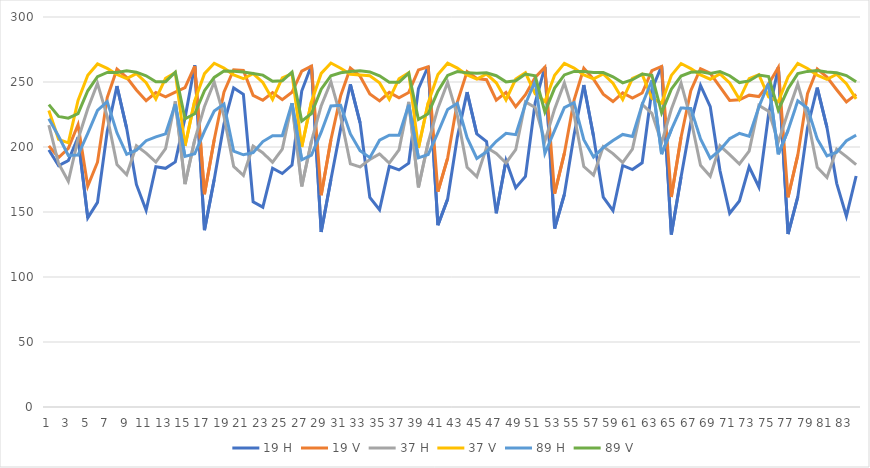
| Category | 19 H | 19 V | 37 H | 37 V | 89 H | 89 V |
|---|---|---|---|---|---|---|
| 0 | 197.769 | 200.875 | 216.859 | 228.152 | 221.763 | 232.606 |
| 1 | 185.664 | 191.903 | 187.264 | 205.915 | 208.273 | 223.528 |
| 2 | 189.548 | 198.976 | 173.655 | 203.203 | 193.484 | 222.172 |
| 3 | 207.463 | 217.152 | 205.976 | 235.809 | 193.845 | 225.63 |
| 4 | 145.507 | 169.91 | 229.481 | 255.208 | 210.51 | 243.242 |
| 5 | 157.408 | 188.291 | 248.959 | 263.892 | 228.168 | 254.049 |
| 6 | 211.956 | 238.039 | 223.364 | 260.446 | 234.919 | 257.399 |
| 7 | 246.916 | 259.882 | 186.434 | 255.78 | 210.897 | 257.335 |
| 8 | 214.356 | 253.575 | 178.645 | 252.611 | 194.408 | 258.591 |
| 9 | 171.186 | 243.856 | 200.997 | 256.49 | 197.506 | 257.573 |
| 10 | 151.32 | 235.644 | 195.333 | 249.518 | 204.865 | 254.809 |
| 11 | 184.835 | 241.928 | 188.452 | 236.967 | 207.812 | 250.217 |
| 12 | 183.611 | 238.499 | 198.761 | 252.907 | 210.122 | 250.267 |
| 13 | 188.514 | 242.228 | 235.13 | 257.22 | 232.905 | 257.479 |
| 14 | 222.418 | 245.686 | 171.485 | 200.885 | 192.765 | 221.663 |
| 15 | 262.908 | 262.143 | 205.641 | 235.632 | 194.791 | 225.559 |
| 16 | 136.057 | 163.69 | 231.211 | 256.427 | 212.262 | 243.298 |
| 17 | 174.997 | 205.547 | 249.913 | 264.417 | 227.663 | 253.489 |
| 18 | 217.568 | 242.205 | 223.716 | 260.647 | 233.077 | 258.399 |
| 19 | 245.41 | 259.436 | 185.052 | 255.526 | 196.796 | 258.195 |
| 20 | 240.513 | 258.865 | 178.175 | 252.521 | 194.008 | 257.662 |
| 21 | 157.787 | 239.756 | 200.717 | 256.419 | 195.578 | 256.552 |
| 22 | 153.734 | 235.932 | 195.523 | 249.618 | 204.179 | 255.292 |
| 23 | 183.719 | 241.878 | 188.256 | 236.606 | 208.667 | 250.536 |
| 24 | 179.601 | 236.429 | 198.349 | 253.148 | 208.614 | 250.898 |
| 25 | 186.087 | 242.062 | 233.408 | 256.359 | 233.625 | 257.6 |
| 26 | 243.01 | 258.297 | 169.693 | 199.983 | 190.145 | 219.896 |
| 27 | 262.859 | 262.201 | 204.563 | 234.893 | 193.731 | 225.786 |
| 28 | 134.625 | 162.928 | 231.695 | 256.625 | 211.386 | 244.472 |
| 29 | 174.96 | 205.64 | 250.122 | 264.617 | 231.616 | 254.818 |
| 30 | 214.145 | 239.511 | 223.516 | 260.631 | 232.127 | 257.093 |
| 31 | 248.231 | 260.749 | 187.072 | 255.909 | 210.057 | 258.098 |
| 32 | 218.624 | 254.467 | 184.681 | 255.447 | 197.082 | 258.637 |
| 33 | 161.145 | 240.715 | 190.402 | 254.83 | 191.835 | 257.762 |
| 34 | 151.719 | 235.473 | 194.673 | 249.335 | 205.212 | 254.758 |
| 35 | 185.155 | 242.043 | 187.645 | 236.764 | 209.076 | 249.807 |
| 36 | 182.35 | 237.913 | 197.755 | 252.54 | 208.99 | 249.771 |
| 37 | 187.488 | 241.961 | 234.751 | 257.168 | 232.473 | 256.797 |
| 38 | 244.882 | 259.31 | 168.993 | 199.278 | 191.649 | 221.194 |
| 39 | 262.133 | 261.748 | 203.482 | 234.001 | 194.213 | 225.605 |
| 40 | 139.836 | 165.69 | 229.919 | 255.81 | 211.102 | 242.864 |
| 41 | 159.936 | 191.497 | 249.57 | 264.436 | 228.863 | 255.028 |
| 42 | 207.6 | 234.578 | 224.103 | 260.686 | 233.633 | 257.98 |
| 43 | 242.17 | 258.022 | 184.358 | 255.392 | 207.118 | 257.023 |
| 44 | 210.087 | 252.634 | 177.17 | 252.183 | 191.203 | 256.68 |
| 45 | 204.178 | 251.727 | 199.589 | 256.131 | 196.327 | 257.038 |
| 46 | 148.96 | 235.982 | 194.995 | 249.389 | 204.373 | 254.815 |
| 47 | 189.615 | 241.984 | 187.709 | 236.179 | 210.517 | 250.101 |
| 48 | 168.624 | 230.916 | 197.922 | 252.293 | 209.499 | 250.979 |
| 49 | 177.323 | 240.191 | 234.678 | 257.098 | 233.082 | 256.088 |
| 50 | 233.977 | 253.515 | 230.421 | 240.989 | 250.877 | 254.697 |
| 51 | 261.551 | 261.441 | 204.491 | 235.02 | 195.064 | 226.933 |
| 52 | 137.302 | 164.057 | 229.28 | 255.238 | 212.74 | 245.331 |
| 53 | 163.478 | 195.035 | 249.278 | 264.309 | 230.233 | 255.46 |
| 54 | 209.361 | 236.104 | 224.811 | 260.7 | 234.109 | 258.14 |
| 55 | 247.684 | 260.532 | 185.002 | 255.382 | 205.641 | 258.031 |
| 56 | 208.296 | 252.233 | 178.282 | 252.352 | 192.286 | 257.272 |
| 57 | 161.478 | 240.672 | 200.336 | 256.161 | 199.683 | 257.251 |
| 58 | 150.989 | 234.98 | 194.913 | 249.11 | 204.991 | 254 |
| 59 | 185.796 | 241.62 | 188.032 | 236.494 | 209.674 | 249.322 |
| 60 | 182.653 | 237.595 | 198.42 | 252.843 | 208.131 | 251.743 |
| 61 | 187.862 | 241.517 | 232.793 | 255.914 | 232.534 | 256.082 |
| 62 | 244.28 | 258.801 | 225.941 | 237.462 | 251.346 | 255.04 |
| 63 | 262.191 | 261.997 | 203.258 | 233.731 | 194.515 | 226.341 |
| 64 | 132.7 | 161.545 | 228.998 | 255.086 | 213.326 | 244.456 |
| 65 | 176.862 | 207.453 | 249.2 | 264.212 | 230.032 | 254.528 |
| 66 | 218.916 | 243.331 | 221.723 | 260.293 | 229.65 | 257.453 |
| 67 | 247.384 | 260.202 | 185.966 | 255.533 | 206.242 | 257.949 |
| 68 | 231.09 | 256.702 | 177.512 | 252.147 | 191.296 | 256.61 |
| 69 | 181.925 | 246.326 | 200.938 | 256.206 | 197.712 | 257.997 |
| 70 | 149.005 | 235.825 | 194.119 | 249.275 | 206.432 | 254.822 |
| 71 | 158.509 | 236.286 | 186.939 | 236.629 | 210.493 | 249.567 |
| 72 | 184.797 | 239.888 | 196.881 | 252.616 | 208.258 | 250.837 |
| 73 | 169.218 | 238.808 | 231.995 | 255.625 | 230.797 | 255.367 |
| 74 | 225.18 | 248.538 | 227.442 | 238.513 | 249.249 | 254.148 |
| 75 | 261.277 | 261.306 | 203.924 | 234.779 | 194.4 | 228.271 |
| 76 | 133.067 | 161.323 | 226.983 | 253.95 | 212.827 | 244.797 |
| 77 | 161.629 | 193.709 | 248.45 | 264.31 | 235.502 | 256.425 |
| 78 | 214.793 | 241.041 | 222.591 | 260.374 | 229.91 | 258.147 |
| 79 | 245.748 | 260.098 | 184.418 | 255.321 | 206.223 | 258.784 |
| 80 | 215.022 | 253.778 | 176.555 | 252.082 | 193.174 | 257.759 |
| 81 | 172.069 | 244.04 | 198.323 | 255.967 | 195.957 | 257.045 |
| 82 | 146.799 | 234.606 | 192.636 | 248.742 | 204.831 | 254.977 |
| 83 | 177.682 | 240.528 | 186.475 | 237.017 | 209.11 | 250.235 |